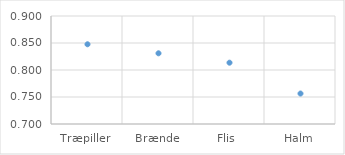
| Category | Series 0 |
|---|---|
| Træpiller | 0.848 |
| Brænde | 0.831 |
| Flis | 0.814 |
| Halm | 0.756 |